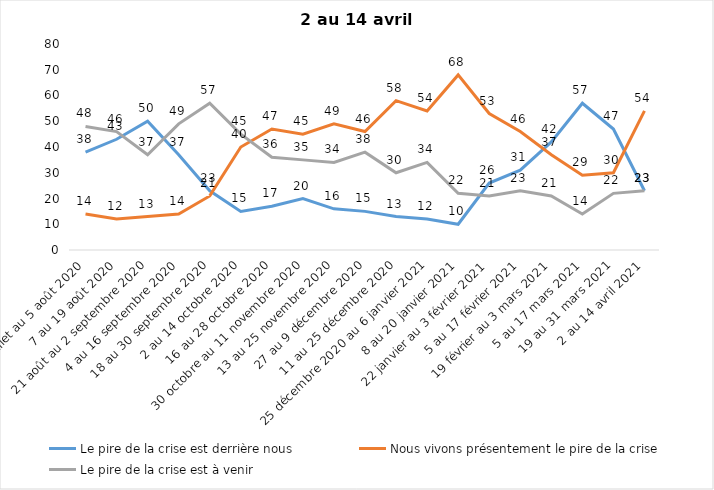
| Category | Le pire de la crise est derrière nous | Nous vivons présentement le pire de la crise | Le pire de la crise est à venir |
|---|---|---|---|
| 24 juillet au 5 août 2020 | 38 | 14 | 48 |
| 7 au 19 août 2020 | 43 | 12 | 46 |
| 21 août au 2 septembre 2020 | 50 | 13 | 37 |
| 4 au 16 septembre 2020 | 37 | 14 | 49 |
| 18 au 30 septembre 2020 | 23 | 21 | 57 |
| 2 au 14 octobre 2020 | 15 | 40 | 45 |
| 16 au 28 octobre 2020 | 17 | 47 | 36 |
| 30 octobre au 11 novembre 2020 | 20 | 45 | 35 |
| 13 au 25 novembre 2020 | 16 | 49 | 34 |
| 27 au 9 décembre 2020 | 15 | 46 | 38 |
| 11 au 25 décembre 2020 | 13 | 58 | 30 |
| 25 décembre 2020 au 6 janvier 2021 | 12 | 54 | 34 |
| 8 au 20 janvier 2021 | 10 | 68 | 22 |
| 22 janvier au 3 février 2021 | 26 | 53 | 21 |
| 5 au 17 février 2021 | 31 | 46 | 23 |
| 19 février au 3 mars 2021 | 42 | 37 | 21 |
| 5 au 17 mars 2021 | 57 | 29 | 14 |
| 19 au 31 mars 2021 | 47 | 30 | 22 |
| 2 au 14 avril 2021 | 23 | 54 | 23 |